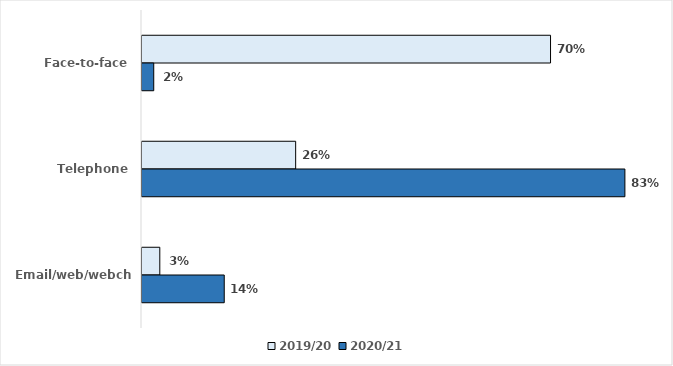
| Category | 2019/20 | 2020/21 |
|---|---|---|
| Face-to-face | 0.704 | 0.02 |
| Telephone | 0.265 | 0.833 |
| Email/web/webchat | 0.031 | 0.142 |